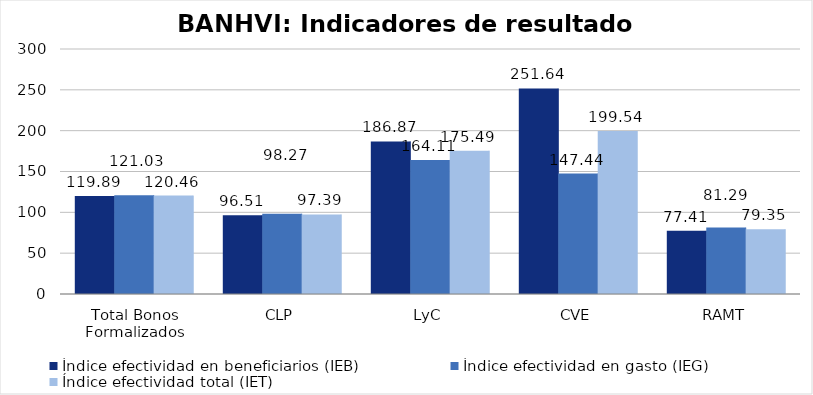
| Category | Índice efectividad en beneficiarios (IEB) | Índice efectividad en gasto (IEG)  | Índice efectividad total (IET) |
|---|---|---|---|
| Total Bonos Formalizados | 119.892 | 121.03 | 120.461 |
| CLP | 96.51 | 98.271 | 97.39 |
| LyC | 186.866 | 164.107 | 175.487 |
| CVE | 251.641 | 147.437 | 199.539 |
| RAMT | 77.408 | 81.291 | 79.349 |